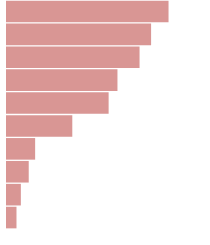
| Category | Series 0 |
|---|---|
| 0 | 8076900 |
| 1 | 7204500 |
| 2 | 6627470 |
| 3 | 5522560 |
| 4 | 5081160 |
| 5 | 3264760 |
| 6 | 1406700 |
| 7 | 1086360 |
| 8 | 692560 |
| 9 | 474480 |